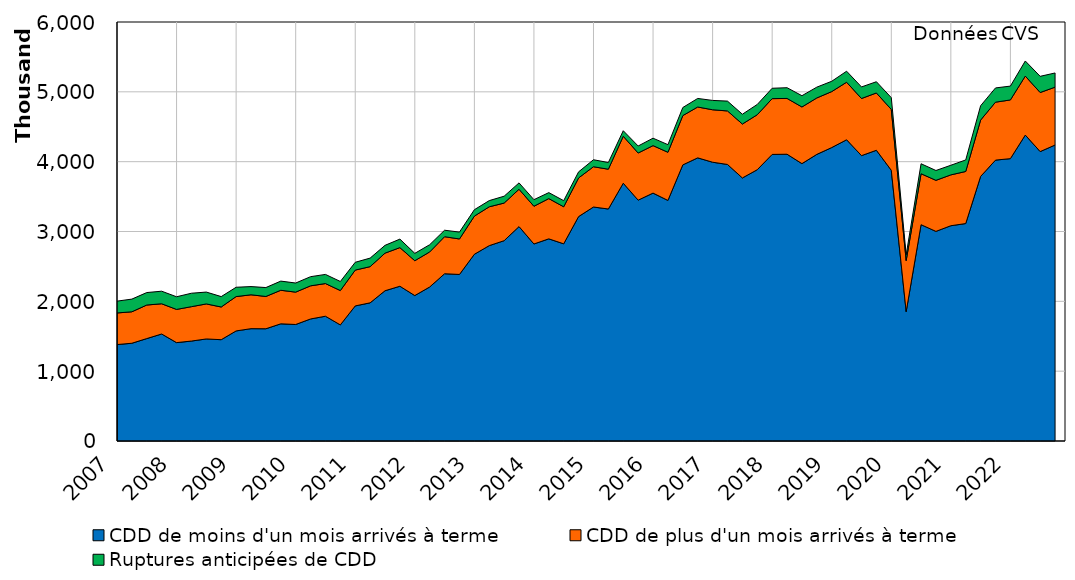
| Category | CDD de moins d'un mois arrivés à terme | CDD de plus d'un mois arrivés à terme | Ruptures anticipées de CDD |
|---|---|---|---|
| 2007-01-01 | 1380770 | 452736 | 169153 |
| 2007-04-01 | 1399850 | 450500 | 181543 |
| 2007-07-01 | 1466759 | 480355 | 178502 |
| 2007-10-01 | 1532399 | 432689 | 179986 |
| 2008-01-01 | 1408923 | 475103 | 181534 |
| 2008-04-01 | 1431269 | 492351 | 192498 |
| 2008-07-01 | 1461410 | 501425 | 169742 |
| 2008-10-01 | 1450569 | 468433 | 149018 |
| 2009-01-01 | 1576178 | 491857 | 133461 |
| 2009-04-01 | 1608625 | 485108 | 117395 |
| 2009-07-01 | 1607226 | 462401 | 127578 |
| 2009-10-01 | 1677962 | 480401 | 131418 |
| 2010-01-01 | 1668442 | 463215 | 130447 |
| 2010-04-01 | 1747527 | 474373 | 131246 |
| 2010-07-01 | 1786669 | 467814 | 130930 |
| 2010-10-01 | 1662543 | 491876 | 129914 |
| 2011-01-01 | 1934475 | 512910 | 111820 |
| 2011-04-01 | 1978669 | 518081 | 122311 |
| 2011-07-01 | 2151768 | 538192 | 111801 |
| 2011-10-01 | 2216183 | 552991 | 122082 |
| 2012-01-01 | 2082855 | 498638 | 105621 |
| 2012-04-01 | 2205604 | 501848 | 103669 |
| 2012-07-01 | 2395208 | 530306 | 92789 |
| 2012-10-01 | 2384714 | 508144 | 98795 |
| 2013-01-01 | 2674144 | 546103 | 92032 |
| 2013-04-01 | 2797519 | 556440 | 88398 |
| 2013-07-01 | 2868659 | 538782 | 98115 |
| 2013-10-01 | 3070875 | 533749 | 91609 |
| 2014-01-01 | 2821350 | 540399 | 94126 |
| 2014-04-01 | 2895042 | 576120 | 85700 |
| 2014-07-01 | 2823708 | 530471 | 87660 |
| 2014-10-01 | 3213780 | 553067 | 87188 |
| 2015-01-01 | 3350644 | 576874 | 100070 |
| 2015-04-01 | 3322150 | 569562 | 95912 |
| 2015-07-01 | 3691170 | 672276 | 79556 |
| 2015-10-01 | 3448633 | 675416 | 100363 |
| 2016-01-01 | 3549947 | 679845 | 106479 |
| 2016-04-01 | 3444832 | 689689 | 109043 |
| 2016-07-01 | 3953858 | 706073 | 115662 |
| 2016-10-01 | 4054586 | 728028 | 122760 |
| 2017-01-01 | 3992275 | 751117 | 133677 |
| 2017-04-01 | 3959891 | 766379 | 140685 |
| 2017-07-01 | 3766802 | 772018 | 140506 |
| 2017-10-01 | 3884895 | 787580 | 146941 |
| 2018-01-01 | 4103954 | 798511 | 148627 |
| 2018-04-01 | 4106437 | 799180 | 153405 |
| 2018-07-01 | 3972040 | 811152 | 161479 |
| 2018-10-01 | 4104462 | 808121 | 154763 |
| 2019-01-01 | 4202011 | 801608 | 147596 |
| 2019-04-01 | 4313624 | 824025 | 157565 |
| 2019-07-01 | 4086092 | 818307 | 165732 |
| 2019-10-01 | 4163364 | 820468 | 160908 |
| 2020-01-01 | 3876503 | 871795 | 168452 |
| 2020-04-01 | 1851993 | 731803 | 81553 |
| 2020-07-01 | 3097361 | 729913 | 143058 |
| 2020-10-01 | 3001612 | 731151 | 140774 |
| 2021-01-01 | 3082760 | 728093 | 137785 |
| 2021-04-01 | 3113865 | 745596 | 165114 |
| 2021-07-01 | 3788521 | 807035 | 205437 |
| 2021-10-01 | 4022235 | 829850 | 203834 |
| 2022-01-01 | 4043432 | 840456 | 198132 |
| 2022-04-01 | 4381163 | 844376 | 216330 |
| 2022-07-01 | 4144405 | 845680 | 232026 |
| 2022-10-01 | 4238365 | 828575 | 203112 |